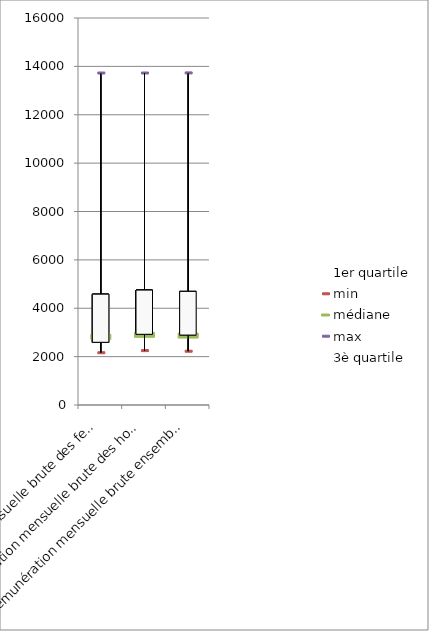
| Category | 1er quartile | min | médiane | max | 3è quartile |
|---|---|---|---|---|---|
| Rémunération mensuelle brute des femmes | 2593 | 2161 | 2841 | 13726 | 4582 |
| Rémunération mensuelle brute des hommes | 2923 | 2248 | 2923 | 13726 | 4751 |
| Rémunération mensuelle brute ensemble | 2891 | 2223 | 2891 | 13730 | 4697 |